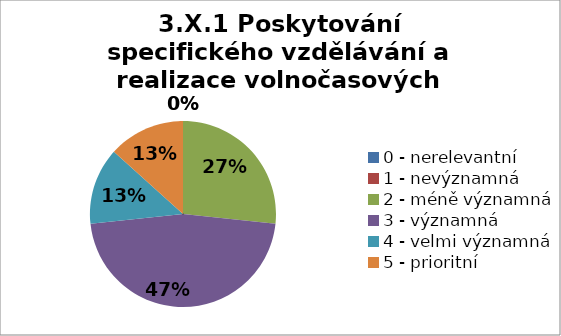
| Category | Series 3 | Series 2 | Series 1 | Series 0 |
|---|---|---|---|---|
| 0 - nerelevantní | 0 | 0 | 0 | 0 |
| 1 - nevýznamná | 0 | 6.667 | 0 | 0 |
| 2 - méně významná | 26.667 | 0 | 6.667 | 0 |
| 3 - významná | 46.667 | 53.333 | 46.667 | 33.333 |
| 4 - velmi významná | 13.333 | 40 | 33.333 | 40 |
| 5 - prioritní | 13.333 | 0 | 13.333 | 26.667 |